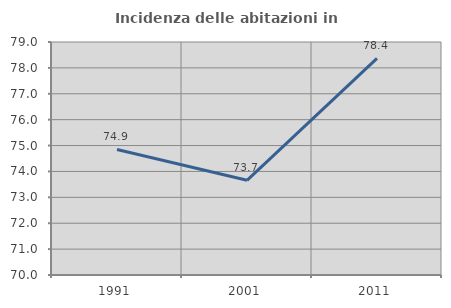
| Category | Incidenza delle abitazioni in proprietà  |
|---|---|
| 1991.0 | 74.85 |
| 2001.0 | 73.657 |
| 2011.0 | 78.365 |